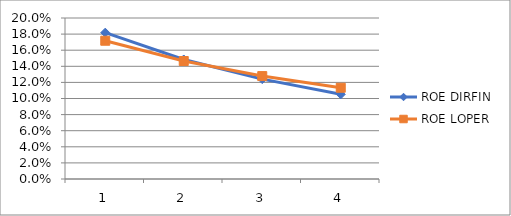
| Category | ROE DIRFIN | ROE LOPER |
|---|---|---|
| 0 | 0.182 | 0.172 |
| 1 | 0.148 | 0.147 |
| 2 | 0.124 | 0.128 |
| 3 | 0.105 | 0.113 |